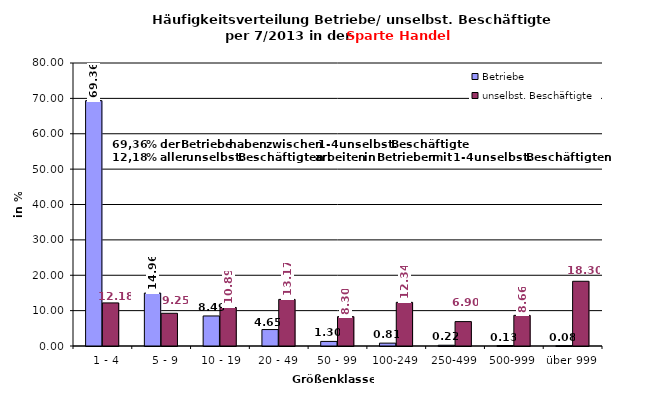
| Category | Betriebe | unselbst. Beschäftigte |
|---|---|---|
|   1 - 4 | 69.36 | 12.178 |
|   5 - 9 | 14.96 | 9.246 |
|  10 - 19 | 8.493 | 10.892 |
| 20 - 49 | 4.647 | 13.174 |
| 50 - 99 | 1.295 | 8.303 |
| 100-249 | 0.812 | 12.343 |
| 250-499 | 0.216 | 6.899 |
| 500-999 | 0.134 | 8.665 |
| über 999 | 0.082 | 18.299 |